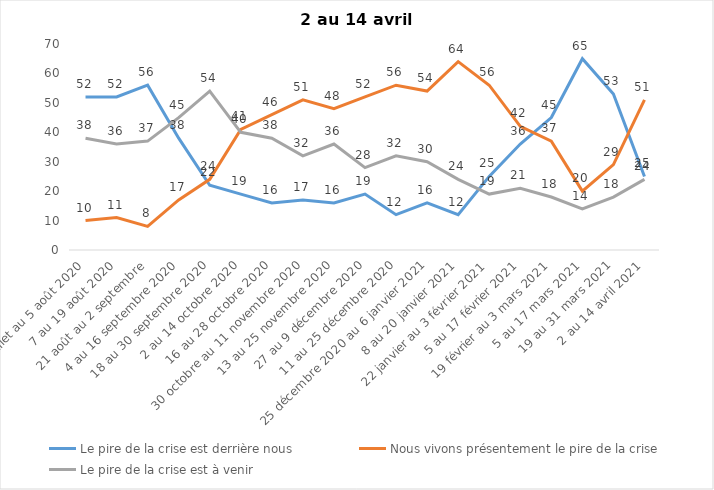
| Category | Le pire de la crise est derrière nous | Nous vivons présentement le pire de la crise | Le pire de la crise est à venir |
|---|---|---|---|
| 24 juillet au 5 août 2020 | 52 | 10 | 38 |
| 7 au 19 août 2020 | 52 | 11 | 36 |
| 21 août au 2 septembre | 56 | 8 | 37 |
| 4 au 16 septembre 2020 | 38 | 17 | 45 |
| 18 au 30 septembre 2020 | 22 | 24 | 54 |
| 2 au 14 octobre 2020 | 19 | 41 | 40 |
| 16 au 28 octobre 2020 | 16 | 46 | 38 |
| 30 octobre au 11 novembre 2020 | 17 | 51 | 32 |
| 13 au 25 novembre 2020 | 16 | 48 | 36 |
| 27 au 9 décembre 2020 | 19 | 52 | 28 |
| 11 au 25 décembre 2020 | 12 | 56 | 32 |
| 25 décembre 2020 au 6 janvier 2021 | 16 | 54 | 30 |
| 8 au 20 janvier 2021 | 12 | 64 | 24 |
| 22 janvier au 3 février 2021 | 25 | 56 | 19 |
| 5 au 17 février 2021 | 36 | 42 | 21 |
| 19 février au 3 mars 2021 | 45 | 37 | 18 |
| 5 au 17 mars 2021 | 65 | 20 | 14 |
| 19 au 31 mars 2021 | 53 | 29 | 18 |
| 2 au 14 avril 2021 | 25 | 51 | 24 |